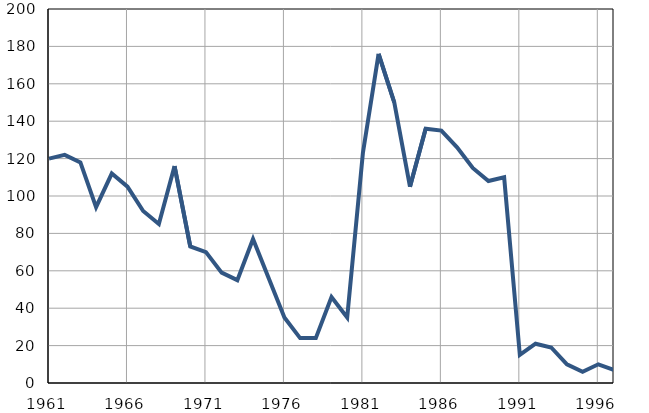
| Category | Умрла 
одојчад |
|---|---|
| 1961.0 | 120 |
| 1962.0 | 122 |
| 1963.0 | 118 |
| 1964.0 | 94 |
| 1965.0 | 112 |
| 1966.0 | 105 |
| 1967.0 | 92 |
| 1968.0 | 85 |
| 1969.0 | 116 |
| 1970.0 | 73 |
| 1971.0 | 70 |
| 1972.0 | 59 |
| 1973.0 | 55 |
| 1974.0 | 77 |
| 1975.0 | 56 |
| 1976.0 | 35 |
| 1977.0 | 24 |
| 1978.0 | 24 |
| 1979.0 | 46 |
| 1980.0 | 35 |
| 1981.0 | 123 |
| 1982.0 | 176 |
| 1983.0 | 150 |
| 1984.0 | 105 |
| 1985.0 | 136 |
| 1986.0 | 135 |
| 1987.0 | 126 |
| 1988.0 | 115 |
| 1989.0 | 108 |
| 1990.0 | 110 |
| 1991.0 | 15 |
| 1992.0 | 21 |
| 1993.0 | 19 |
| 1994.0 | 10 |
| 1995.0 | 6 |
| 1996.0 | 10 |
| 1997.0 | 7 |